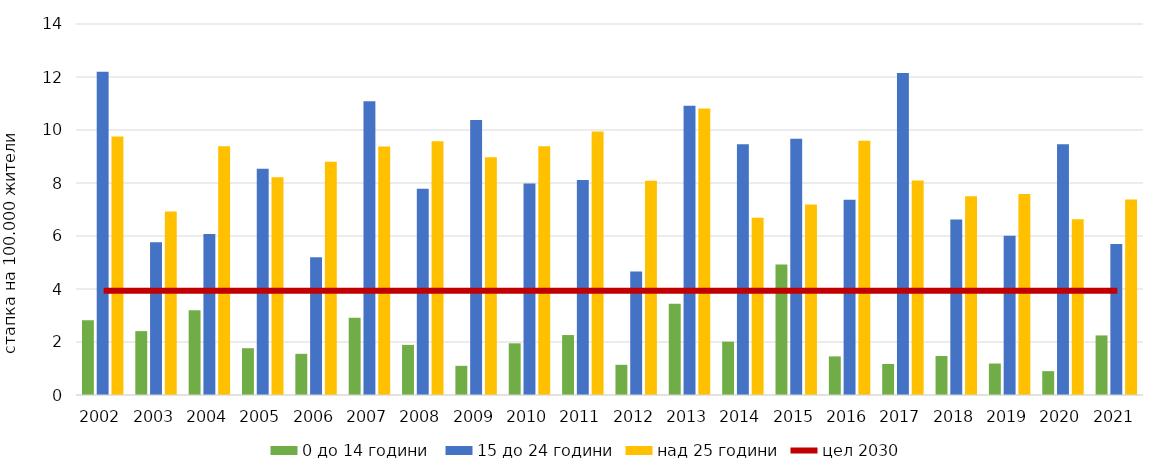
| Category | 0 до 14 години  | 15 до 24 години | над 25 години |
|---|---|---|---|
| 2002.0 | 2.824 | 12.198 | 9.758 |
| 2003.0 | 2.41 | 5.764 | 6.924 |
| 2004.0 | 3.202 | 6.077 | 9.384 |
| 2005.0 | 1.766 | 8.539 | 8.218 |
| 2006.0 | 1.553 | 5.199 | 8.806 |
| 2007.0 | 2.914 | 11.089 | 9.382 |
| 2008.0 | 1.891 | 7.781 | 9.579 |
| 2009.0 | 1.101 | 10.38 | 8.969 |
| 2010.0 | 1.95 | 7.984 | 9.385 |
| 2011.0 | 2.262 | 8.111 | 9.944 |
| 2012.0 | 1.139 | 4.656 | 8.083 |
| 2013.0 | 3.444 | 10.918 | 10.813 |
| 2014.0 | 2.014 | 9.46 | 6.685 |
| 2015.0 | 4.929 | 9.666 | 7.187 |
| 2016.0 | 1.456 | 7.367 | 9.596 |
| 2017.0 | 1.17 | 12.155 | 8.095 |
| 2018.0 | 1.471 | 6.622 | 7.498 |
| 2019.0 | 1.188 | 6.007 | 7.584 |
| 2020.0 | 0.9 | 9.459 | 6.635 |
| 2021.0 | 2.248 | 5.698 | 7.378 |